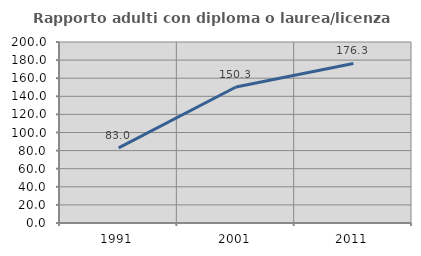
| Category | Rapporto adulti con diploma o laurea/licenza media  |
|---|---|
| 1991.0 | 82.955 |
| 2001.0 | 150.258 |
| 2011.0 | 176.329 |